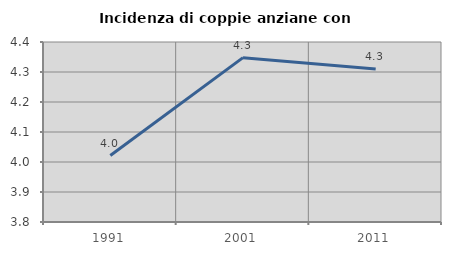
| Category | Incidenza di coppie anziane con figli |
|---|---|
| 1991.0 | 4.021 |
| 2001.0 | 4.348 |
| 2011.0 | 4.31 |